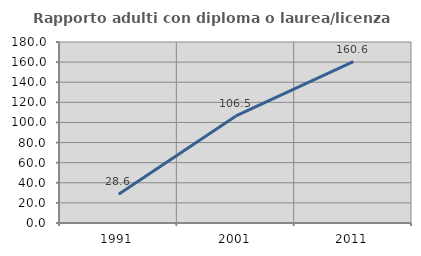
| Category | Rapporto adulti con diploma o laurea/licenza media  |
|---|---|
| 1991.0 | 28.571 |
| 2001.0 | 106.516 |
| 2011.0 | 160.558 |